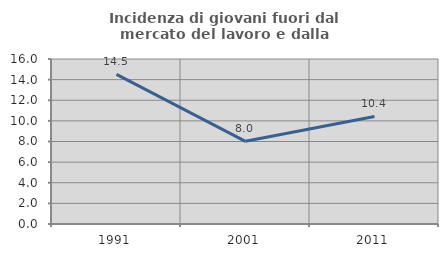
| Category | Incidenza di giovani fuori dal mercato del lavoro e dalla formazione  |
|---|---|
| 1991.0 | 14.508 |
| 2001.0 | 8.019 |
| 2011.0 | 10.427 |